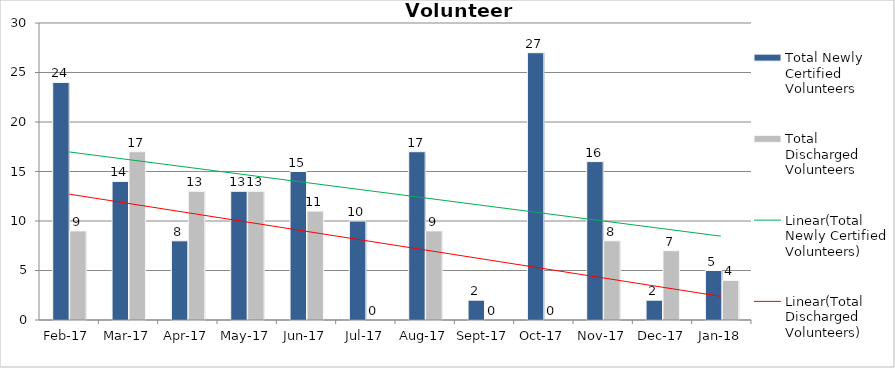
| Category | Total Newly Certified Volunteers | Total Discharged Volunteers |
|---|---|---|
| 2017-02-01 | 24 | 9 |
| 2017-03-01 | 14 | 17 |
| 2017-04-01 | 8 | 13 |
| 2017-05-01 | 13 | 13 |
| 2017-06-01 | 15 | 11 |
| 2017-07-01 | 10 | 0 |
| 2017-08-01 | 17 | 9 |
| 2017-09-01 | 2 | 0 |
| 2017-10-01 | 27 | 0 |
| 2017-11-01 | 16 | 8 |
| 2017-12-01 | 2 | 7 |
| 2018-01-01 | 5 | 4 |